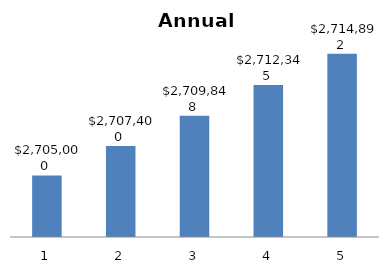
| Category | Series 0 |
|---|---|
| 0 | 2705000 |
| 1 | 2707400 |
| 2 | 2709848 |
| 3 | 2712344.96 |
| 4 | 2714891.859 |